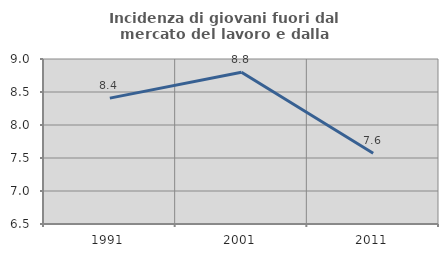
| Category | Incidenza di giovani fuori dal mercato del lavoro e dalla formazione  |
|---|---|
| 1991.0 | 8.407 |
| 2001.0 | 8.798 |
| 2011.0 | 7.572 |